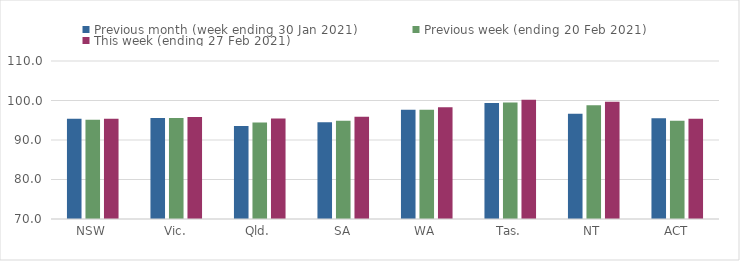
| Category | Previous month (week ending 30 Jan 2021) | Previous week (ending 20 Feb 2021) | This week (ending 27 Feb 2021) |
|---|---|---|---|
| NSW | 95.39 | 95.12 | 95.37 |
| Vic. | 95.6 | 95.55 | 95.85 |
| Qld. | 93.56 | 94.45 | 95.45 |
| SA | 94.51 | 94.9 | 95.86 |
| WA | 97.67 | 97.67 | 98.28 |
| Tas. | 99.34 | 99.48 | 100.17 |
| NT | 96.67 | 98.82 | 99.71 |
| ACT | 95.52 | 94.88 | 95.41 |